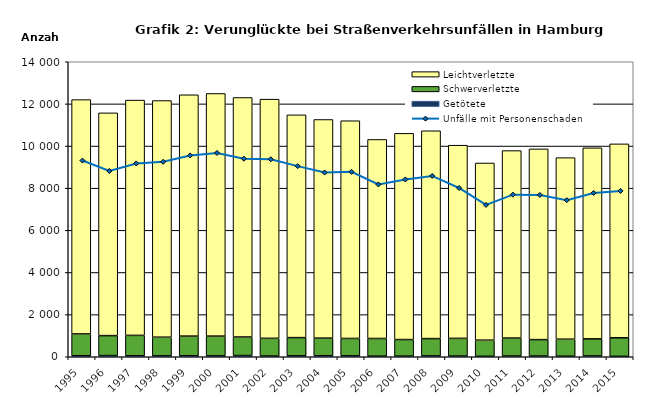
| Category | Getötete | Schwerverletzte | Leichtverletzte |
|---|---|---|---|
| 1995.0 | 46 | 1038 | 11120 |
| 1996.0 | 57 | 946 | 10571 |
| 1997.0 | 46 | 969 | 11166 |
| 1998.0 | 42 | 887 | 11230 |
| 1999.0 | 47 | 933 | 11453 |
| 2000.0 | 41 | 939 | 11515 |
| 2001.0 | 56 | 882 | 11366 |
| 2002.0 | 34 | 841 | 11350 |
| 2003.0 | 44 | 864 | 10573 |
| 2004.0 | 48 | 836 | 10376 |
| 2005.0 | 43 | 826 | 10332 |
| 2006.0 | 28 | 839 | 9446 |
| 2007.0 | 30 | 787 | 9786 |
| 2008.0 | 40 | 821 | 9864 |
| 2009.0 | 33 | 840 | 9167 |
| 2010.0 | 22 | 765 | 8408 |
| 2011.0 | 34 | 853 | 8897 |
| 2012.0 | 33 | 781 | 9051 |
| 2013.0 | 26 | 808 | 8615 |
| 2014.0 | 38 | 812 | 9066 |
| 2015.0 | 20 | 880 | 9203 |